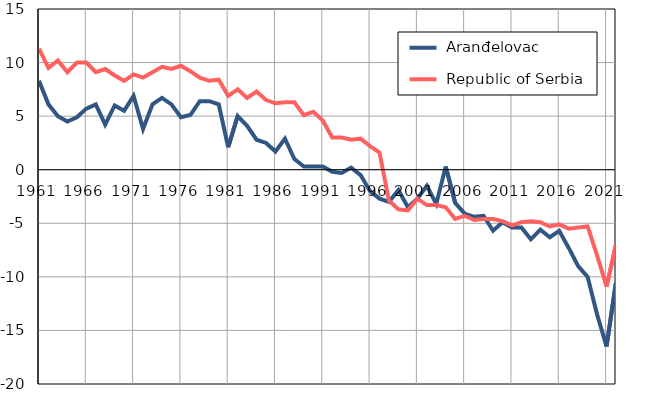
| Category |  Aranđelovac |  Republic of Serbia |
|---|---|---|
| 1961.0 | 8.3 | 11.3 |
| 1962.0 | 6.1 | 9.5 |
| 1963.0 | 5 | 10.2 |
| 1964.0 | 4.5 | 9.1 |
| 1965.0 | 4.9 | 10 |
| 1966.0 | 5.7 | 10 |
| 1967.0 | 6.1 | 9.1 |
| 1968.0 | 4.2 | 9.4 |
| 1969.0 | 6 | 8.8 |
| 1970.0 | 5.5 | 8.3 |
| 1971.0 | 6.9 | 8.9 |
| 1972.0 | 3.8 | 8.6 |
| 1973.0 | 6.1 | 9.1 |
| 1974.0 | 6.7 | 9.6 |
| 1975.0 | 6.1 | 9.4 |
| 1976.0 | 4.9 | 9.7 |
| 1977.0 | 5.1 | 9.2 |
| 1978.0 | 6.4 | 8.6 |
| 1979.0 | 6.4 | 8.3 |
| 1980.0 | 6.1 | 8.4 |
| 1981.0 | 2.1 | 6.9 |
| 1982.0 | 5 | 7.5 |
| 1983.0 | 4.1 | 6.7 |
| 1984.0 | 2.8 | 7.3 |
| 1985.0 | 2.5 | 6.5 |
| 1986.0 | 1.7 | 6.2 |
| 1987.0 | 2.9 | 6.3 |
| 1988.0 | 1 | 6.3 |
| 1989.0 | 0.3 | 5.1 |
| 1990.0 | 0.3 | 5.4 |
| 1991.0 | 0.3 | 4.6 |
| 1992.0 | -0.2 | 3 |
| 1993.0 | -0.3 | 3 |
| 1994.0 | 0.2 | 2.8 |
| 1995.0 | -0.5 | 2.9 |
| 1996.0 | -2 | 2.2 |
| 1997.0 | -2.7 | 1.6 |
| 1998.0 | -3 | -2.9 |
| 1999.0 | -1.9 | -3.7 |
| 2000.0 | -3.5 | -3.8 |
| 2001.0 | -2.7 | -2.7 |
| 2002.0 | -1.5 | -3.3 |
| 2003.0 | -3.2 | -3.3 |
| 2004.0 | 0.3 | -3.5 |
| 2005.0 | -3.1 | -4.6 |
| 2006.0 | -4.1 | -4.3 |
| 2007.0 | -4.4 | -4.7 |
| 2008.0 | -4.3 | -4.6 |
| 2009.0 | -5.7 | -4.6 |
| 2010.0 | -4.9 | -4.8 |
| 2011.0 | -5.4 | -5.2 |
| 2012.0 | -5.4 | -4.9 |
| 2013.0 | -6.5 | -4.8 |
| 2014.0 | -5.6 | -4.9 |
| 2015.0 | -6.3 | -5.3 |
| 2016.0 | -5.7 | -5.1 |
| 2017.0 | -7.3 | -5.5 |
| 2018.0 | -9 | -5.4 |
| 2019.0 | -10 | -5.3 |
| 2020.0 | -13.5 | -8 |
| 2021.0 | -16.5 | -10.9 |
| 2022.0 | -10.5 | -7 |